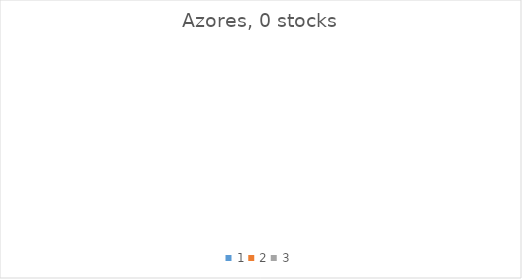
| Category | Azores |
|---|---|
| 0 | 0 |
| 1 | 0 |
| 2 | 0 |